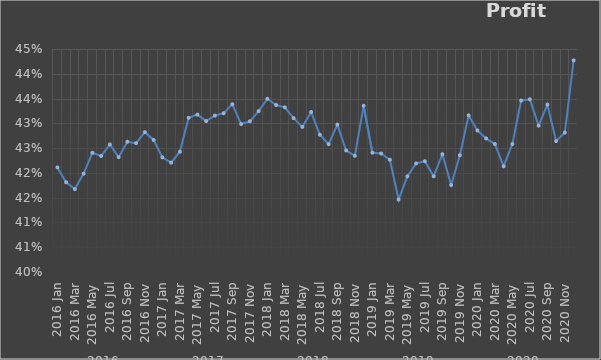
| Category | Total |
|---|---|
| 0 | 0.421 |
| 1 | 0.418 |
| 2 | 0.417 |
| 3 | 0.42 |
| 4 | 0.424 |
| 5 | 0.423 |
| 6 | 0.426 |
| 7 | 0.423 |
| 8 | 0.426 |
| 9 | 0.426 |
| 10 | 0.428 |
| 11 | 0.427 |
| 12 | 0.423 |
| 13 | 0.422 |
| 14 | 0.424 |
| 15 | 0.431 |
| 16 | 0.432 |
| 17 | 0.43 |
| 18 | 0.432 |
| 19 | 0.432 |
| 20 | 0.434 |
| 21 | 0.43 |
| 22 | 0.43 |
| 23 | 0.432 |
| 24 | 0.435 |
| 25 | 0.434 |
| 26 | 0.433 |
| 27 | 0.431 |
| 28 | 0.429 |
| 29 | 0.432 |
| 30 | 0.428 |
| 31 | 0.426 |
| 32 | 0.43 |
| 33 | 0.425 |
| 34 | 0.423 |
| 35 | 0.434 |
| 36 | 0.424 |
| 37 | 0.424 |
| 38 | 0.423 |
| 39 | 0.415 |
| 40 | 0.419 |
| 41 | 0.422 |
| 42 | 0.422 |
| 43 | 0.419 |
| 44 | 0.424 |
| 45 | 0.418 |
| 46 | 0.424 |
| 47 | 0.432 |
| 48 | 0.429 |
| 49 | 0.427 |
| 50 | 0.426 |
| 51 | 0.421 |
| 52 | 0.426 |
| 53 | 0.435 |
| 54 | 0.435 |
| 55 | 0.43 |
| 56 | 0.434 |
| 57 | 0.426 |
| 58 | 0.428 |
| 59 | 0.443 |